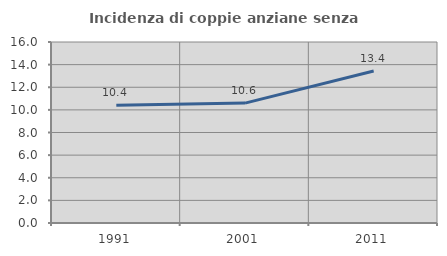
| Category | Incidenza di coppie anziane senza figli  |
|---|---|
| 1991.0 | 10.409 |
| 2001.0 | 10.599 |
| 2011.0 | 13.433 |